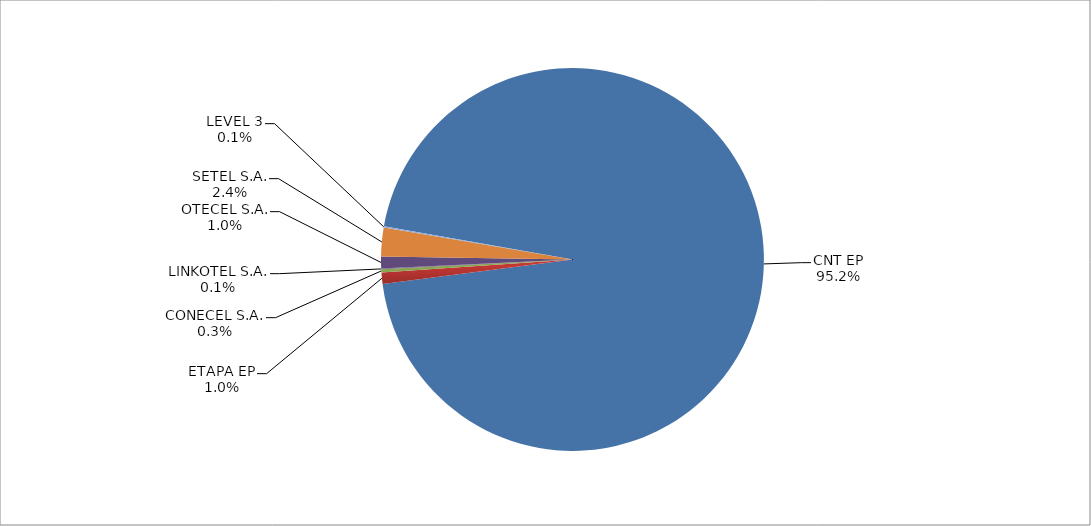
| Category | Series 0 |
|---|---|
| CNT EP | 2566 |
| ETAPA EP | 26 |
| CONECEL S.A. | 7 |
| LINKOTEL S.A. | 2 |
| OTECEL S.A. | 27 |
| SETEL S.A. | 65 |
| LEVEL 3 | 3 |